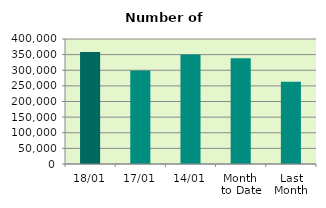
| Category | Series 0 |
|---|---|
| 18/01 | 358174 |
| 17/01 | 298916 |
| 14/01 | 350560 |
| Month 
to Date | 338047.667 |
| Last
Month | 263242 |